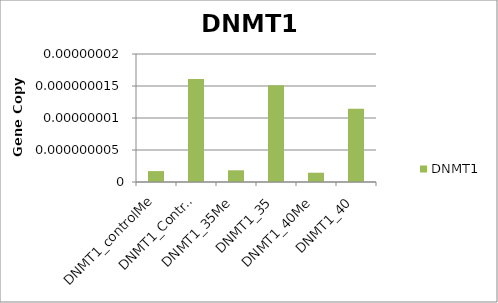
| Category | DNMT1 |
|---|---|
| DNMT1_controlMe | 0 |
| DNMT1_Control | 0 |
| DNMT1_35Me | 0 |
| DNMT1_35 | 0 |
| DNMT1_40Me | 0 |
| DNMT1_40 | 0 |